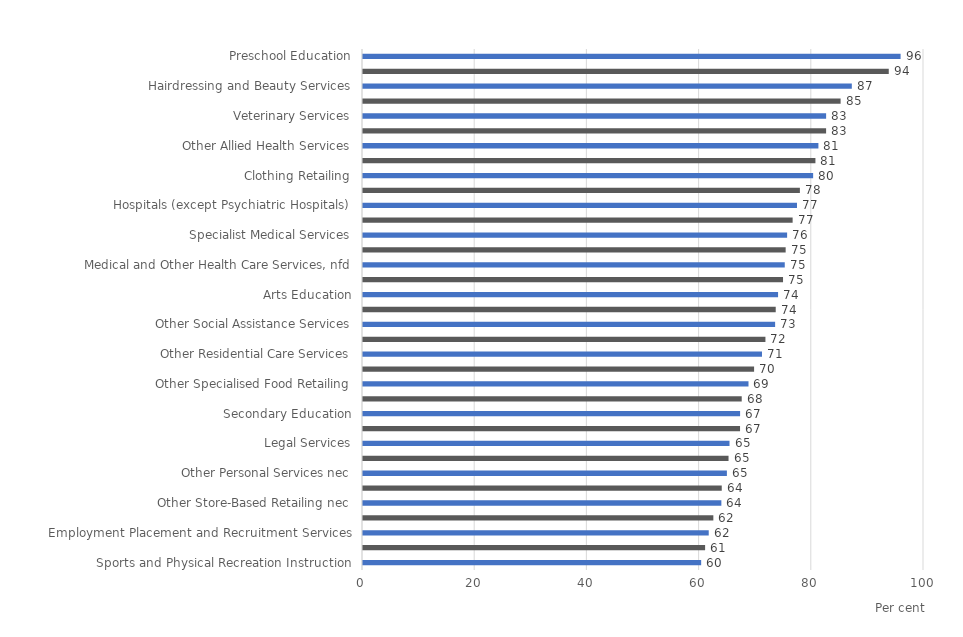
| Category | Female 
(%) |
|---|---|
| Sports and Physical Recreation Instruction | 60.279 |
| Central Government Administration | 60.982 |
| Employment Placement and Recruitment Services | 61.628 |
| Adult, Community and Other Education nec | 62.451 |
| Other Store-Based Retailing nec | 63.88 |
| Health and Fitness Centres and Gymnasia Operation | 63.949 |
| Other Personal Services nec | 64.865 |
| Education and Training, nfd | 65.158 |
| Legal Services | 65.333 |
| Physiotherapy Services | 67.21 |
| Secondary Education | 67.22 |
| Other Interest Group Services nec | 67.508 |
| Other Specialised Food Retailing | 68.716 |
| Department Stores | 69.714 |
| Other Residential Care Services | 71.12 |
| Combined Primary and Secondary Education | 71.735 |
| Other Social Assistance Services | 73.462 |
| General Practice Medical Services | 73.569 |
| Arts Education | 73.988 |
| Pathology and Diagnostic Imaging Services | 74.872 |
| Medical and Other Health Care Services, nfd | 75.181 |
| Social Assistance Services, nfd | 75.339 |
| Specialist Medical Services | 75.6 |
| Health Care and Social Assistance, nfd | 76.583 |
| Hospitals (except Psychiatric Hospitals) | 77.36 |
| Pharmaceutical, Cosmetic and Toiletry Goods Retailing | 77.878 |
| Clothing Retailing | 80.239 |
| Dental Services | 80.646 |
| Other Allied Health Services | 81.178 |
| Aged Care Residential Services | 82.549 |
| Veterinary Services | 82.553 |
| Primary Education | 85.135 |
| Hairdressing and Beauty Services | 87.133 |
| Child Care Services | 93.718 |
| Preschool Education | 95.827 |